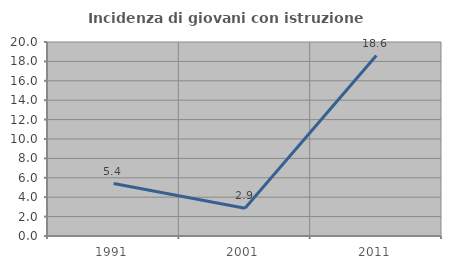
| Category | Incidenza di giovani con istruzione universitaria |
|---|---|
| 1991.0 | 5.405 |
| 2001.0 | 2.857 |
| 2011.0 | 18.605 |